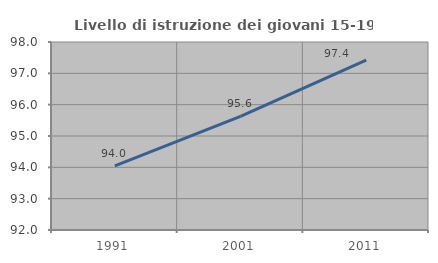
| Category | Livello di istruzione dei giovani 15-19 anni |
|---|---|
| 1991.0 | 94.048 |
| 2001.0 | 95.625 |
| 2011.0 | 97.423 |